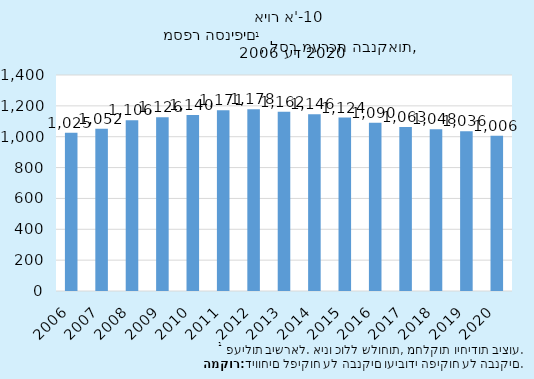
| Category | Series 1 |
|---|---|
| 2006.0 | 1025 |
| 2007.0 | 1052 |
| 2008.0 | 1106 |
| 2009.0 | 1126 |
| 2010.0 | 1140 |
| 2011.0 | 1171 |
| 2012.0 | 1178 |
| 2013.0 | 1162 |
| 2014.0 | 1146 |
| 2015.0 | 1124 |
| 2016.0 | 1090 |
| 2017.0 | 1063 |
| 43465.0 | 1048 |
| 43617.0 | 1036 |
| 2020.0 | 1006 |